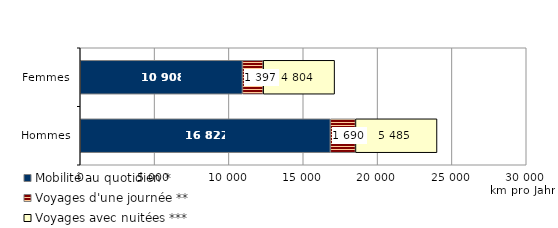
| Category | Mobilité au quotidien * | Voyages d'une journée ** | Voyages avec nuitées *** |
|---|---|---|---|
| Hommes | 16822.133 | 1690.194 | 5484.72 |
| Femmes | 10908.191 | 1396.603 | 4803.829 |